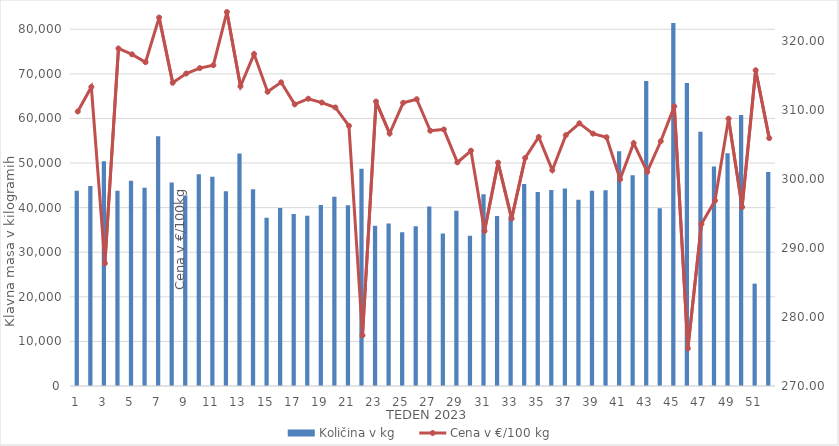
| Category | Količina v kg |
|---|---|
| 0 | 43807 |
| 1 | 44834 |
| 2 | 50386 |
| 3 | 43773 |
| 4 | 46011 |
| 5 | 44439 |
| 6 | 56001 |
| 7 | 45613 |
| 8 | 42730 |
| 9 | 47471 |
| 10 | 46952 |
| 11 | 43683 |
| 12 | 52135 |
| 13 | 44103 |
| 14 | 37719 |
| 15 | 39943 |
| 16 | 38574 |
| 17 | 38200 |
| 18 | 40581 |
| 19 | 42443 |
| 20 | 40517 |
| 21 | 48742 |
| 22 | 35927 |
| 23 | 36436 |
| 24 | 34463 |
| 25 | 35812 |
| 26 | 40280 |
| 27 | 34201 |
| 28 | 39279 |
| 29 | 33702 |
| 30 | 43020 |
| 31 | 38146 |
| 32 | 38070 |
| 33 | 45290 |
| 34 | 43513 |
| 35 | 43945 |
| 36 | 44302 |
| 37 | 41798 |
| 38 | 43790 |
| 39 | 43913 |
| 40 | 52663 |
| 41 | 47275 |
| 42 | 68419 |
| 43 | 39872 |
| 44 | 81439 |
| 45 | 67983 |
| 46 | 57006 |
| 47 | 49204 |
| 48 | 52219 |
| 49 | 60759 |
| 50 | 22954 |
| 51 | 48002 |